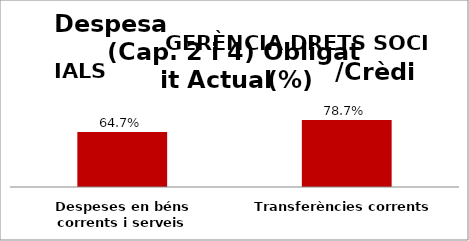
| Category | Series 0 |
|---|---|
| Despeses en béns corrents i serveis | 0.647 |
| Transferències corrents | 0.787 |